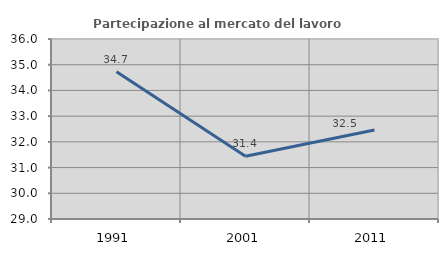
| Category | Partecipazione al mercato del lavoro  femminile |
|---|---|
| 1991.0 | 34.73 |
| 2001.0 | 31.439 |
| 2011.0 | 32.46 |